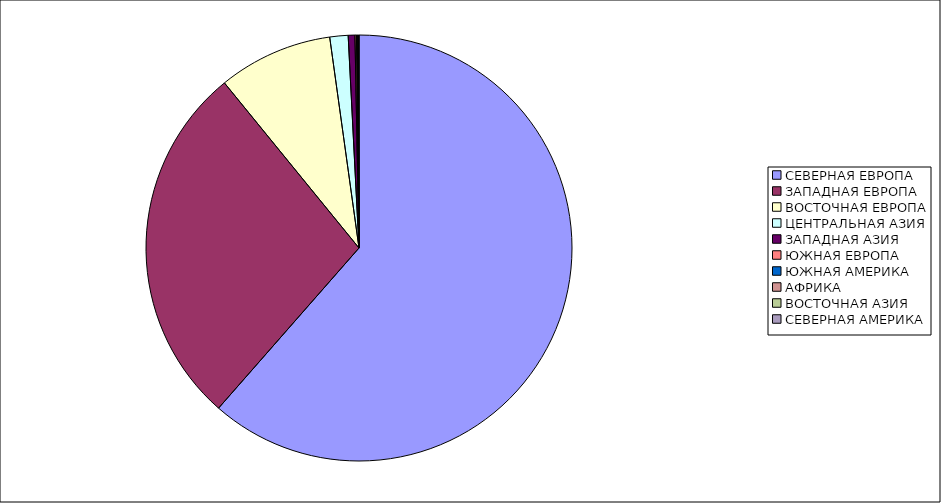
| Category | Оборот |
|---|---|
| СЕВЕРНАЯ ЕВРОПА | 61.457 |
| ЗАПАДНАЯ ЕВРОПА | 27.658 |
| ВОСТОЧНАЯ ЕВРОПА | 8.687 |
| ЦЕНТРАЛЬНАЯ АЗИЯ | 1.388 |
| ЗАПАДНАЯ АЗИЯ | 0.508 |
| ЮЖНАЯ ЕВРОПА | 0.115 |
| ЮЖНАЯ АМЕРИКА | 0.062 |
| АФРИКА | 0.057 |
| ВОСТОЧНАЯ АЗИЯ | 0.046 |
| СЕВЕРНАЯ АМЕРИКА | 0.023 |